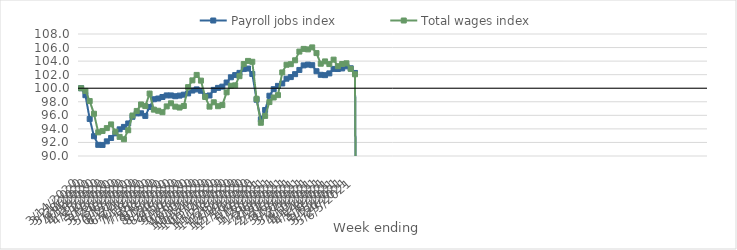
| Category | Payroll jobs index | Total wages index |
|---|---|---|
| 14/03/2020 | 100 | 100 |
| 21/03/2020 | 98.972 | 99.605 |
| 28/03/2020 | 95.467 | 98.106 |
| 04/04/2020 | 92.921 | 96.238 |
| 11/04/2020 | 91.648 | 93.491 |
| 18/04/2020 | 91.631 | 93.694 |
| 25/04/2020 | 92.161 | 94.113 |
| 02/05/2020 | 92.658 | 94.66 |
| 09/05/2020 | 93.343 | 93.583 |
| 16/05/2020 | 93.936 | 92.817 |
| 23/05/2020 | 94.294 | 92.471 |
| 30/05/2020 | 94.802 | 93.799 |
| 06/06/2020 | 95.786 | 95.975 |
| 13/06/2020 | 96.286 | 96.648 |
| 20/06/2020 | 96.302 | 97.605 |
| 27/06/2020 | 95.914 | 97.364 |
| 04/07/2020 | 97.234 | 99.209 |
| 11/07/2020 | 98.377 | 96.842 |
| 18/07/2020 | 98.483 | 96.672 |
| 25/07/2020 | 98.707 | 96.464 |
| 01/08/2020 | 98.939 | 97.319 |
| 08/08/2020 | 98.937 | 97.774 |
| 15/08/2020 | 98.822 | 97.284 |
| 22/08/2020 | 98.911 | 97.15 |
| 29/08/2020 | 99.048 | 97.377 |
| 05/09/2020 | 99.236 | 100.159 |
| 12/09/2020 | 99.656 | 101.158 |
| 19/09/2020 | 99.825 | 101.963 |
| 26/09/2020 | 99.625 | 101.122 |
| 03/10/2020 | 98.824 | 98.703 |
| 10/10/2020 | 98.93 | 97.286 |
| 17/10/2020 | 99.758 | 97.926 |
| 24/10/2020 | 100.051 | 97.346 |
| 31/10/2020 | 100.234 | 97.513 |
| 07/11/2020 | 100.843 | 99.39 |
| 14/11/2020 | 101.614 | 100.362 |
| 21/11/2020 | 101.941 | 100.423 |
| 28/11/2020 | 102.262 | 101.777 |
| 05/12/2020 | 102.828 | 103.567 |
| 12/12/2020 | 102.902 | 104.028 |
| 19/12/2020 | 102.101 | 103.902 |
| 26/12/2020 | 98.307 | 98.441 |
| 02/01/2021 | 95.41 | 94.903 |
| 09/01/2021 | 96.79 | 95.912 |
| 16/01/2021 | 98.893 | 97.958 |
| 23/01/2021 | 99.862 | 98.634 |
| 30/01/2021 | 100.346 | 98.978 |
| 06/02/2021 | 100.698 | 102.329 |
| 13/02/2021 | 101.406 | 103.465 |
| 20/02/2021 | 101.644 | 103.55 |
| 27/02/2021 | 102.078 | 104.122 |
| 06/03/2021 | 102.697 | 105.405 |
| 13/03/2021 | 103.369 | 105.802 |
| 20/03/2021 | 103.483 | 105.731 |
| 27/03/2021 | 103.4 | 106.023 |
| 03/04/2021 | 102.51 | 105.184 |
| 10/04/2021 | 101.979 | 103.615 |
| 17/04/2021 | 101.926 | 103.956 |
| 24/04/2021 | 102.186 | 103.563 |
| 01/05/2021 | 102.848 | 104.217 |
| 08/05/2021 | 102.834 | 103.251 |
| 15/05/2021 | 102.922 | 103.573 |
| 22/05/2021 | 103.224 | 103.677 |
| 29/05/2021 | 102.941 | 102.856 |
| 05/06/2021 | 102.252 | 102.059 |